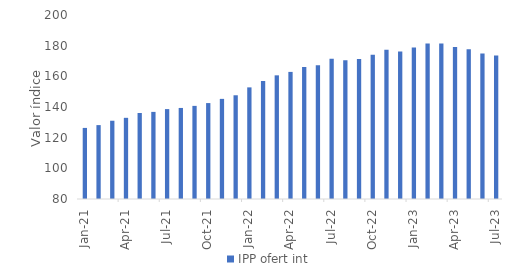
| Category | IPP ofert int |
|---|---|
| 2021-01-01 | 126.36 |
| 2021-02-01 | 128.19 |
| 2021-03-01 | 131.04 |
| 2021-04-01 | 132.94 |
| 2021-05-01 | 136.1 |
| 2021-06-01 | 136.81 |
| 2021-07-01 | 138.63 |
| 2021-08-01 | 139.38 |
| 2021-09-01 | 140.73 |
| 2021-10-01 | 142.56 |
| 2021-11-01 | 145.3 |
| 2021-12-01 | 147.65 |
| 2022-01-01 | 152.8 |
| 2022-02-01 | 156.94 |
| 2022-03-01 | 160.65 |
| 2022-04-01 | 162.89 |
| 2022-05-01 | 166.16 |
| 2022-06-01 | 167.21 |
| 2022-07-01 | 171.4 |
| 2022-08-01 | 170.53 |
| 2022-09-01 | 171.26 |
| 2022-10-01 | 174.12 |
| 2022-11-01 | 177.36 |
| 2022-12-01 | 176.17 |
| 2023-01-01 | 178.736 |
| 2023-02-01 | 181.43 |
| 2023-03-01 | 181.36 |
| 2023-04-01 | 179.17 |
| 2023-05-01 | 177.7 |
| 2023-06-01 | 174.91 |
| 2023-07-01 | 173.52 |